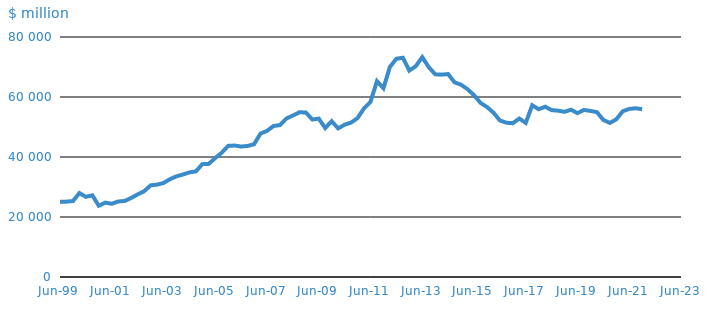
| Category | Series 0 |
|---|---|
| 1985-09-01 | 12045 |
| 1985-12-01 | 11654 |
| 1986-03-01 | 11465 |
| 1986-06-01 | 11883 |
| 1986-09-01 | 11494 |
| 1986-12-01 | 12617 |
| 1987-03-01 | 11900 |
| 1987-06-01 | 13133 |
| 1987-09-01 | 13086 |
| 1987-12-01 | 13979 |
| 1988-03-01 | 14531 |
| 1988-06-01 | 15482 |
| 1988-09-01 | 14366 |
| 1988-12-01 | 15792 |
| 1989-03-01 | 16667 |
| 1989-06-01 | 17016 |
| 1989-09-01 | 16791 |
| 1989-12-01 | 16407 |
| 1990-03-01 | 15892 |
| 1990-06-01 | 15115 |
| 1990-09-01 | 15097 |
| 1990-12-01 | 14347 |
| 1991-03-01 | 13302 |
| 1991-06-01 | 13142 |
| 1991-09-01 | 12583 |
| 1991-12-01 | 12376 |
| 1992-03-01 | 12726 |
| 1992-06-01 | 12606 |
| 1992-09-01 | 12162 |
| 1992-12-01 | 14661 |
| 1993-03-01 | 13659 |
| 1993-06-01 | 13899 |
| 1993-09-01 | 13578 |
| 1993-12-01 | 13974 |
| 1994-03-01 | 15238 |
| 1994-06-01 | 15497 |
| 1994-09-01 | 16272 |
| 1994-12-01 | 17198 |
| 1995-03-01 | 17155 |
| 1995-06-01 | 18023 |
| 1995-09-01 | 18094 |
| 1995-12-01 | 18298 |
| 1996-03-01 | 19892 |
| 1996-06-01 | 20614 |
| 1996-09-01 | 20648 |
| 1996-12-01 | 20793 |
| 1997-03-01 | 21335 |
| 1997-06-01 | 23595 |
| 1997-09-01 | 22730 |
| 1997-12-01 | 22733 |
| 1998-03-01 | 26830 |
| 1998-06-01 | 23828 |
| 1998-09-01 | 23489 |
| 1998-12-01 | 24153 |
| 1999-03-01 | 23613 |
| 1999-06-01 | 25063 |
| 1999-09-01 | 25127 |
| 1999-12-01 | 25297 |
| 2000-03-01 | 27973 |
| 2000-06-01 | 26723 |
| 2000-09-01 | 27221 |
| 2000-12-01 | 23742 |
| 2001-03-01 | 24792 |
| 2001-06-01 | 24408 |
| 2001-09-01 | 25170 |
| 2001-12-01 | 25336 |
| 2002-03-01 | 26339 |
| 2002-06-01 | 27542 |
| 2002-09-01 | 28567 |
| 2002-12-01 | 30538 |
| 2003-03-01 | 30802 |
| 2003-06-01 | 31337 |
| 2003-09-01 | 32593 |
| 2003-12-01 | 33557 |
| 2004-03-01 | 34152 |
| 2004-06-01 | 34863 |
| 2004-09-01 | 35204 |
| 2004-12-01 | 37616 |
| 2005-03-01 | 37710 |
| 2005-06-01 | 39673 |
| 2005-09-01 | 41423 |
| 2005-12-01 | 43712 |
| 2006-03-01 | 43820 |
| 2006-06-01 | 43485 |
| 2006-09-01 | 43699 |
| 2006-12-01 | 44249 |
| 2007-03-01 | 47811 |
| 2007-06-01 | 48704 |
| 2007-09-01 | 50318 |
| 2007-12-01 | 50645 |
| 2008-03-01 | 52837 |
| 2008-06-01 | 53827 |
| 2008-09-01 | 54899 |
| 2008-12-01 | 54851 |
| 2009-03-01 | 52514 |
| 2009-06-01 | 52784 |
| 2009-09-01 | 49634 |
| 2009-12-01 | 51934 |
| 2010-03-01 | 49543 |
| 2010-06-01 | 50762 |
| 2010-09-01 | 51472 |
| 2010-12-01 | 52971 |
| 2011-03-01 | 56228 |
| 2011-06-01 | 58372 |
| 2011-09-01 | 65283 |
| 2011-12-01 | 62929 |
| 2012-03-01 | 70029 |
| 2012-06-01 | 72752 |
| 2012-09-01 | 73082 |
| 2012-12-01 | 68801 |
| 2013-03-01 | 70278 |
| 2013-06-01 | 73290 |
| 2013-09-01 | 69963 |
| 2013-12-01 | 67560 |
| 2014-03-01 | 67449 |
| 2014-06-01 | 67646 |
| 2014-09-01 | 64878 |
| 2014-12-01 | 64103 |
| 2015-03-01 | 62587 |
| 2015-06-01 | 60620 |
| 2015-09-01 | 58041 |
| 2015-12-01 | 56676 |
| 2016-03-01 | 54803 |
| 2016-06-01 | 52175 |
| 2016-09-01 | 51419 |
| 2016-12-01 | 51268 |
| 2017-03-01 | 52826 |
| 2017-06-01 | 51366 |
| 2017-09-01 | 57242 |
| 2017-12-01 | 55922 |
| 2018-03-01 | 56767 |
| 2018-06-01 | 55618 |
| 2018-09-01 | 55445 |
| 2018-12-01 | 55058 |
| 2019-03-01 | 55768 |
| 2019-06-01 | 54605 |
| 2019-09-01 | 55694 |
| 2019-12-01 | 55358 |
| 2020-03-01 | 54946 |
| 2020-06-01 | 52342 |
| 2020-09-01 | 51364 |
| 2020-12-01 | 52566 |
| 2021-03-01 | 55257 |
| 2021-06-01 | 56023 |
| 2021-09-01 | 56242 |
| 2021-12-01 | 55933 |